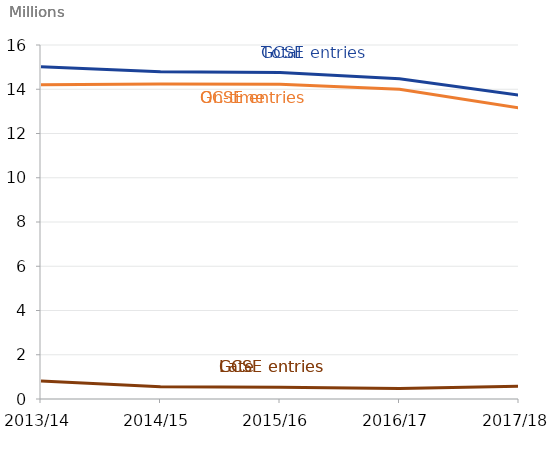
| Category | Total GCSE Entries | On-time entries | Late entries |
|---|---|---|---|
| 2013/14 | 15013270 | 14201660 | 811610 |
| 2014/15 | 14791385 | 14235425 | 555965 |
| 2015/16 | 14757365 | 14230195 | 527170 |
| 2016/17 | 14476135 | 14004445 | 471685 |
| 2017/18 | 13734005 | 13160570 | 573435 |